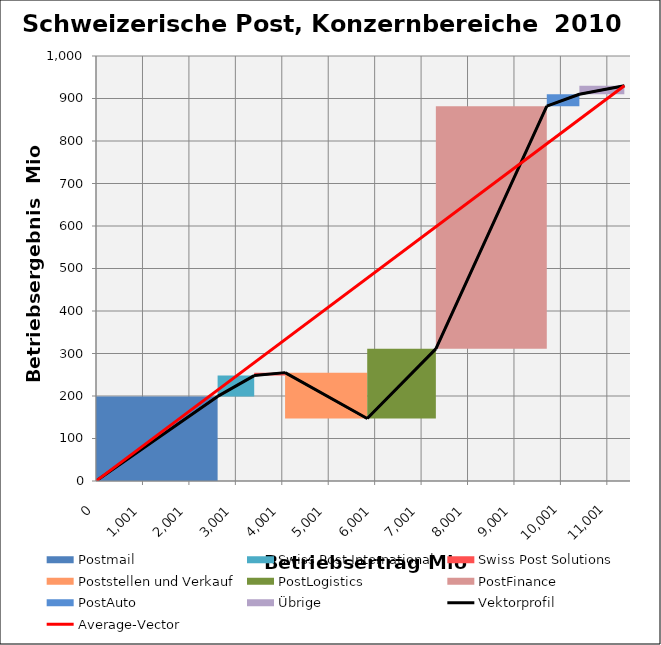
| Category | transparent | Postmail | Swiss Post International | Swiss Post Solutions | Poststellen und Verkauf | PostLogistics | PostFinance | PostAuto | Übrige | Border right & top |
|---|---|---|---|---|---|---|---|---|---|---|
| 0.0 | 0 | 199 | 0 | 0 | 0 | 0 | 0 | 0 | 0 | 0 |
| 2619.0 | 0 | 199 | 0 | 0 | 0 | 0 | 0 | 0 | 0 | 0 |
| 2619.0 | 199 | 0 | 49 | 0 | 0 | 0 | 0 | 0 | 0 | 0 |
| 3407.0 | 199 | 0 | 49 | 0 | 0 | 0 | 0 | 0 | 0 | 0 |
| 3407.0 | 248 | 0 | 0 | 7 | 0 | 0 | 0 | 0 | 0 | 0 |
| 4072.0 | 248 | 0 | 0 | 7 | 0 | 0 | 0 | 0 | 0 | 0 |
| 4072.0 | 255 | 0 | 0 | 0 | -108 | 0 | 0 | 0 | 0 | 0 |
| 5841.0 | 255 | 0 | 0 | 0 | -108 | 0 | 0 | 0 | 0 | 0 |
| 5841.0 | 147 | 0 | 0 | 0 | 0 | 164 | 0 | 0 | 0 | 0 |
| 7319.0 | 147 | 0 | 0 | 0 | 0 | 164 | 0 | 0 | 0 | 0 |
| 7319.0 | 311 | 0 | 0 | 0 | 0 | 0 | 571 | 0 | 0 | 0 |
| 9708.0 | 311 | 0 | 0 | 0 | 0 | 0 | 571 | 0 | 0 | 0 |
| 9708.0 | 882 | 0 | 0 | 0 | 0 | 0 | 0 | 28 | 0 | 0 |
| 10410.0 | 882 | 0 | 0 | 0 | 0 | 0 | 0 | 28 | 0 | 0 |
| 10410.0 | 910 | 0 | 0 | 0 | 0 | 0 | 0 | 0 | 20 | 0 |
| 11378.0 | 910 | 0 | 0 | 0 | 0 | 0 | 0 | 0 | 20 | 0 |
| 11378.0 | 930 | 0 | 0 | 0 | 0 | 0 | 0 | 0 | 0 | 0 |
| 11378.0 | 930 | 0 | 0 | 0 | 0 | 0 | 0 | 0 | 0 | 0 |
| 11378.0 | 930 | 0 | 0 | 0 | 0 | 0 | 0 | 0 | 0 | 0 |
| 11378.0 | 930 | 0 | 0 | 0 | 0 | 0 | 0 | 0 | 0 | 0 |
| 11378.0 | 930 | 0 | 0 | 0 | 0 | 0 | 0 | 0 | 0 | 0 |
| 11500.0 | 930 | 0 | 0 | 0 | 0 | 0 | 0 | 0 | 0 | 0 |
| 11500.0 | 930 | 0 | 0 | 0 | 0 | 0 | 0 | 0 | 0 | 0 |